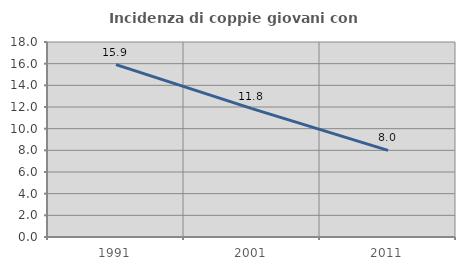
| Category | Incidenza di coppie giovani con figli |
|---|---|
| 1991.0 | 15.912 |
| 2001.0 | 11.847 |
| 2011.0 | 7.996 |